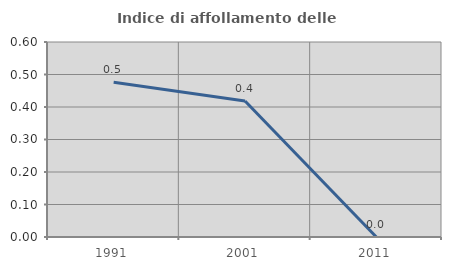
| Category | Indice di affollamento delle abitazioni  |
|---|---|
| 1991.0 | 0.476 |
| 2001.0 | 0.418 |
| 2011.0 | 0 |